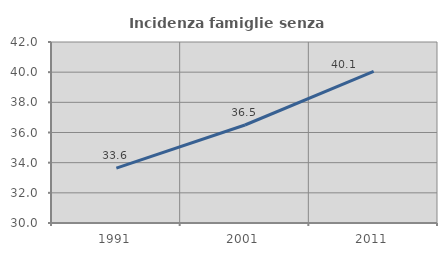
| Category | Incidenza famiglie senza nuclei |
|---|---|
| 1991.0 | 33.639 |
| 2001.0 | 36.497 |
| 2011.0 | 40.053 |